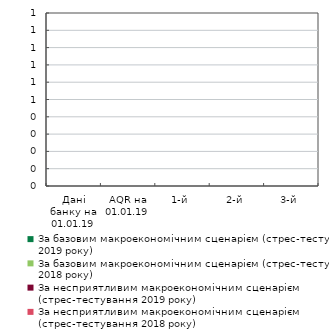
| Category | За базовим макроекономічним сценарієм (стрес-тестування 2019 року) | За базовим макроекономічним сценарієм (стрес-тестування 2018 року) | За несприятливим макроекономічним сценарієм (стрес-тестування 2019 року) | За несприятливим макроекономічним сценарієм (стрес-тестування 2018 року) |
|---|---|---|---|---|
| Дані банку на 01.01.19 | 0 | 0 | 0 | 0 |
| AQR на 01.01.19 | 0 | 0 | 0 | 0 |
| 1-й | 0 | 0 | 0 | 0 |
| 2-й | 0 | 0 | 0 | 0 |
| 3-й | 0 | 0 | 0 | 0 |